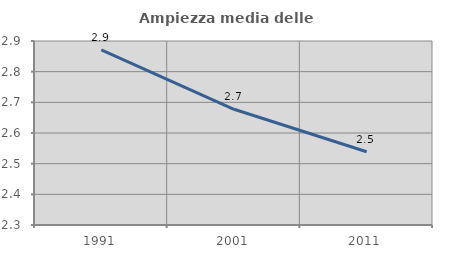
| Category | Ampiezza media delle famiglie |
|---|---|
| 1991.0 | 2.871 |
| 2001.0 | 2.677 |
| 2011.0 | 2.539 |